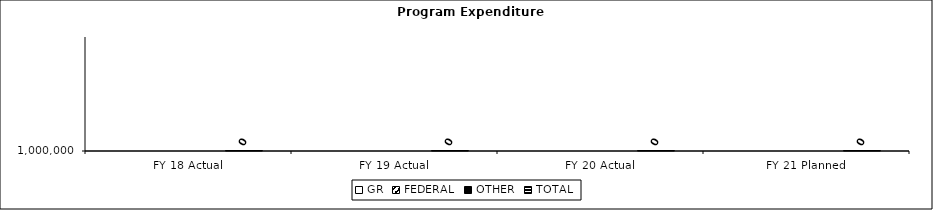
| Category | GR | FEDERAL | OTHER | TOTAL |
|---|---|---|---|---|
| FY 18 Actual |  |  |  | 0 |
| FY 19 Actual |  |  |  | 0 |
| FY 20 Actual |  |  |  | 0 |
| FY 21 Planned |  |  |  | 0 |